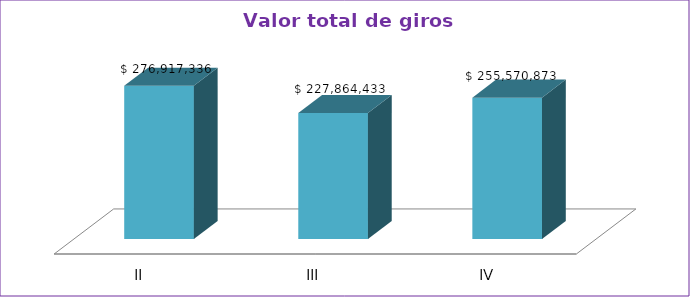
| Category | Series 0 |
|---|---|
| II | 276917336 |
| III | 227864433 |
| IV | 255570873 |